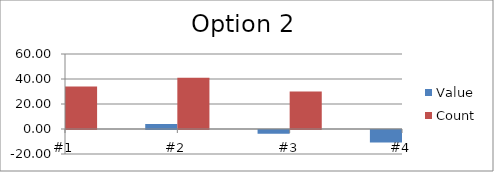
| Category | Value | Count |
|---|---|---|
| #1 | 10 | 34 |
| #2 | 4 | 41 |
| #3 | -3 | 30 |
| #4 | -10 | 53 |